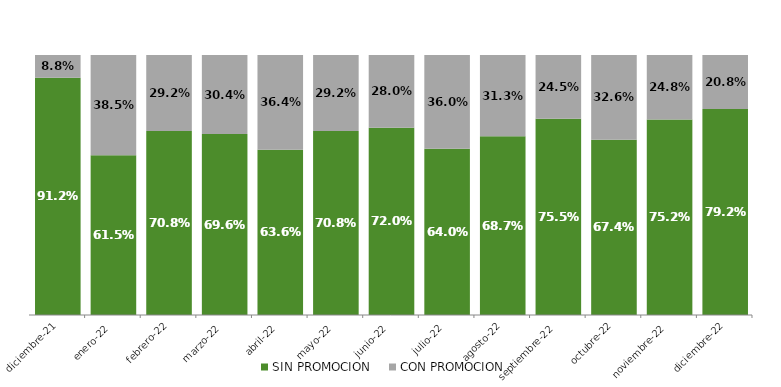
| Category | SIN PROMOCION   | CON PROMOCION   |
|---|---|---|
| 2021-12-01 | 0.912 | 0.088 |
| 2022-01-01 | 0.615 | 0.385 |
| 2022-02-01 | 0.708 | 0.292 |
| 2022-03-01 | 0.696 | 0.304 |
| 2022-04-01 | 0.636 | 0.364 |
| 2022-05-01 | 0.708 | 0.292 |
| 2022-06-01 | 0.72 | 0.28 |
| 2022-07-01 | 0.64 | 0.36 |
| 2022-08-01 | 0.687 | 0.313 |
| 2022-09-01 | 0.755 | 0.245 |
| 2022-10-01 | 0.674 | 0.326 |
| 2022-11-01 | 0.752 | 0.248 |
| 2022-12-01 | 0.792 | 0.208 |